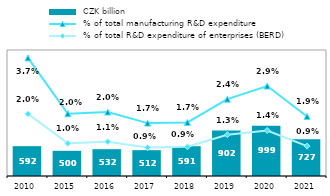
| Category |  CZK billion |
|---|---|
| 2010.0 | 592.056 |
| 2015.0 | 499.552 |
| 2016.0 | 531.732 |
| 2017.0 | 512.334 |
| 2018.0 | 591.173 |
| 2019.0 | 901.621 |
| 2020.0 | 998.727 |
| 2021.0 | 727.253 |